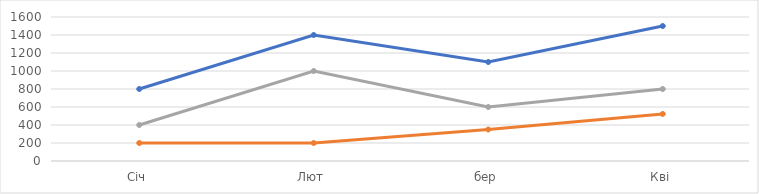
| Category | Ольга | Георгій | Олег |
|---|---|---|---|
| Січ | 800 | 200 | 400 |
| Лют | 1400 | 200 | 1000 |
| бер | 1100 | 350 | 600 |
| Кві | 1500 | 523 | 800 |